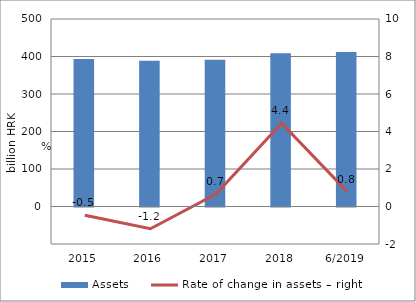
| Category | Assets |
|---|---|
| 2015 | 393.394 |
| 2016 | 388.722 |
| 2017 | 391.304 |
| 2018 | 408.667 |
| 6/2019 | 411.909 |